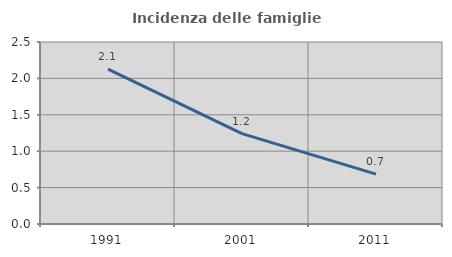
| Category | Incidenza delle famiglie numerose |
|---|---|
| 1991.0 | 2.128 |
| 2001.0 | 1.242 |
| 2011.0 | 0.684 |